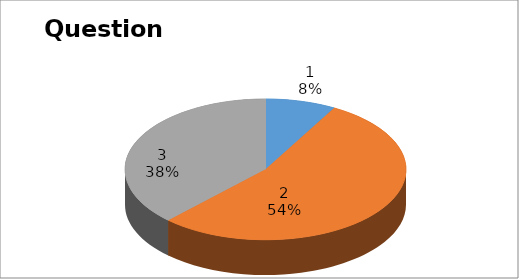
| Category | Series 0 |
|---|---|
| 0 | 3 |
| 1 | 20 |
| 2 | 14 |